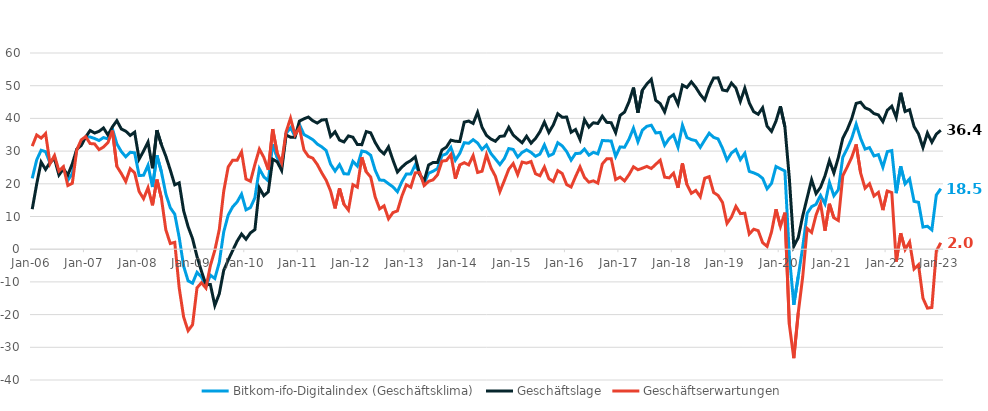
| Category | Bitkom-ifo-Digitalindex (Geschäftsklima) | Geschäftslage | Geschäftserwartungen |
|---|---|---|---|
| 2006-01-01 | 21.66 | 12.23 | 31.51 |
| 2006-02-01 | 27.29 | 19.9 | 34.93 |
| 2006-03-01 | 30.27 | 26.64 | 33.97 |
| 2006-04-01 | 29.82 | 24.39 | 35.37 |
| 2006-05-01 | 26.34 | 26.53 | 26.15 |
| 2006-06-01 | 28.18 | 27.72 | 28.64 |
| 2006-07-01 | 23.3 | 22.69 | 23.91 |
| 2006-08-01 | 24.9 | 24.57 | 25.23 |
| 2006-09-01 | 21.08 | 22.71 | 19.47 |
| 2006-10-01 | 23.12 | 26.12 | 20.15 |
| 2006-11-01 | 30.47 | 30.59 | 30.35 |
| 2006-12-01 | 32.56 | 31.7 | 33.42 |
| 2007-01-01 | 34.36 | 34.29 | 34.43 |
| 2007-02-01 | 34.31 | 36.31 | 32.31 |
| 2007-03-01 | 33.86 | 35.53 | 32.2 |
| 2007-04-01 | 33.23 | 36.04 | 30.45 |
| 2007-05-01 | 34.13 | 37.07 | 31.23 |
| 2007-06-01 | 33.75 | 34.92 | 32.58 |
| 2007-07-01 | 36.84 | 37.39 | 36.28 |
| 2007-08-01 | 32.21 | 39.31 | 25.32 |
| 2007-09-01 | 29.87 | 36.78 | 23.16 |
| 2007-10-01 | 28.26 | 36.1 | 20.69 |
| 2007-11-01 | 29.65 | 34.79 | 24.63 |
| 2007-12-01 | 29.47 | 35.79 | 23.32 |
| 2008-01-01 | 22.54 | 27.54 | 17.64 |
| 2008-02-01 | 22.6 | 30.01 | 15.44 |
| 2008-03-01 | 25.67 | 32.75 | 18.8 |
| 2008-04-01 | 19.02 | 24.77 | 13.41 |
| 2008-05-01 | 28.71 | 36.38 | 21.3 |
| 2008-06-01 | 23.68 | 31.99 | 15.67 |
| 2008-07-01 | 16.89 | 28.44 | 5.92 |
| 2008-08-01 | 12.68 | 24.22 | 1.73 |
| 2008-09-01 | 10.71 | 19.68 | 2.1 |
| 2008-10-01 | 3.59 | 20.29 | -11.84 |
| 2008-11-01 | -5.19 | 11.75 | -20.77 |
| 2008-12-01 | -9.68 | 6.89 | -24.93 |
| 2009-01-01 | -10.4 | 3.22 | -23.12 |
| 2009-02-01 | -7.08 | -2.24 | -11.8 |
| 2009-03-01 | -8.51 | -6.75 | -10.25 |
| 2009-04-01 | -11.37 | -10.87 | -11.88 |
| 2009-05-01 | -7.93 | -10.8 | -5.02 |
| 2009-06-01 | -8.96 | -17.21 | -0.34 |
| 2009-07-01 | -4.06 | -13.64 | 6 |
| 2009-08-01 | 5.3 | -6.45 | 17.75 |
| 2009-09-01 | 10.42 | -3.34 | 25.14 |
| 2009-10-01 | 12.94 | -0.43 | 27.2 |
| 2009-11-01 | 14.44 | 2.43 | 27.17 |
| 2009-12-01 | 16.84 | 4.64 | 29.76 |
| 2010-01-01 | 12.05 | 3.05 | 21.45 |
| 2010-02-01 | 12.74 | 5 | 20.77 |
| 2010-03-01 | 15.73 | 5.98 | 25.94 |
| 2010-04-01 | 24.6 | 18.75 | 30.6 |
| 2010-05-01 | 22.15 | 16.35 | 28.1 |
| 2010-06-01 | 20.88 | 17.54 | 24.26 |
| 2010-07-01 | 32.07 | 27.51 | 36.72 |
| 2010-08-01 | 28.07 | 26.73 | 29.43 |
| 2010-09-01 | 25.23 | 24.1 | 26.36 |
| 2010-10-01 | 35.4 | 34.93 | 35.86 |
| 2010-11-01 | 37.14 | 34.26 | 40.05 |
| 2010-12-01 | 34.57 | 34.21 | 34.93 |
| 2011-01-01 | 38.14 | 39.18 | 37.1 |
| 2011-02-01 | 35.08 | 39.87 | 30.4 |
| 2011-03-01 | 34.33 | 40.41 | 28.4 |
| 2011-04-01 | 33.49 | 39.28 | 27.83 |
| 2011-05-01 | 32.16 | 38.58 | 25.91 |
| 2011-06-01 | 31.3 | 39.5 | 23.37 |
| 2011-07-01 | 30.18 | 39.63 | 21.1 |
| 2011-08-01 | 25.99 | 34.51 | 17.77 |
| 2011-09-01 | 23.89 | 35.91 | 12.47 |
| 2011-10-01 | 25.87 | 33.37 | 18.62 |
| 2011-11-01 | 23.06 | 32.79 | 13.73 |
| 2011-12-01 | 23.01 | 34.64 | 11.96 |
| 2012-01-01 | 26.87 | 34.25 | 19.73 |
| 2012-02-01 | 25.41 | 32.02 | 18.98 |
| 2012-03-01 | 30.03 | 31.97 | 28.11 |
| 2012-04-01 | 29.73 | 35.98 | 23.66 |
| 2012-05-01 | 28.72 | 35.58 | 22.05 |
| 2012-06-01 | 24.17 | 32.65 | 16 |
| 2012-07-01 | 21.16 | 30.36 | 12.33 |
| 2012-08-01 | 21.05 | 29.13 | 13.25 |
| 2012-09-01 | 20.02 | 31.3 | 9.29 |
| 2012-10-01 | 19.06 | 27.23 | 11.2 |
| 2012-11-01 | 17.57 | 23.6 | 11.71 |
| 2012-12-01 | 20.63 | 25.11 | 16.24 |
| 2013-01-01 | 22.99 | 26.32 | 19.71 |
| 2013-02-01 | 22.99 | 27.1 | 18.94 |
| 2013-03-01 | 25.78 | 28.25 | 23.34 |
| 2013-04-01 | 23.14 | 22.84 | 23.45 |
| 2013-05-01 | 20.18 | 20.88 | 19.48 |
| 2013-06-01 | 23.23 | 25.76 | 20.74 |
| 2013-07-01 | 23.84 | 26.5 | 21.2 |
| 2013-08-01 | 24.64 | 26.53 | 22.76 |
| 2013-09-01 | 28.64 | 30.35 | 26.95 |
| 2013-10-01 | 29.16 | 31.22 | 27.11 |
| 2013-11-01 | 31.12 | 33.36 | 28.91 |
| 2013-12-01 | 27.21 | 33.02 | 21.55 |
| 2014-01-01 | 29.32 | 32.92 | 25.76 |
| 2014-02-01 | 32.57 | 38.86 | 26.45 |
| 2014-03-01 | 32.39 | 39.19 | 25.78 |
| 2014-04-01 | 33.49 | 38.45 | 28.63 |
| 2014-05-01 | 32.47 | 41.85 | 23.46 |
| 2014-06-01 | 30.47 | 37.29 | 23.84 |
| 2014-07-01 | 31.84 | 34.79 | 28.92 |
| 2014-08-01 | 29.25 | 33.69 | 24.89 |
| 2014-09-01 | 27.6 | 33.01 | 22.31 |
| 2014-10-01 | 25.88 | 34.49 | 17.58 |
| 2014-11-01 | 27.7 | 34.64 | 20.96 |
| 2014-12-01 | 30.78 | 37.28 | 24.46 |
| 2015-01-01 | 30.5 | 34.9 | 26.19 |
| 2015-02-01 | 28.19 | 33.7 | 22.81 |
| 2015-03-01 | 29.58 | 32.55 | 26.64 |
| 2015-04-01 | 30.39 | 34.54 | 26.31 |
| 2015-05-01 | 29.61 | 32.43 | 26.82 |
| 2015-06-01 | 28.41 | 33.86 | 23.08 |
| 2015-07-01 | 29.09 | 35.93 | 22.46 |
| 2015-08-01 | 31.91 | 38.88 | 25.15 |
| 2015-09-01 | 28.52 | 35.7 | 21.57 |
| 2015-10-01 | 29.18 | 38 | 20.68 |
| 2015-11-01 | 32.56 | 41.42 | 24.03 |
| 2015-12-01 | 31.6 | 40.37 | 23.14 |
| 2016-01-01 | 29.85 | 40.4 | 19.76 |
| 2016-02-01 | 27.24 | 35.76 | 19.02 |
| 2016-03-01 | 29.29 | 36.61 | 22.2 |
| 2016-04-01 | 29.31 | 33.52 | 25.18 |
| 2016-05-01 | 30.61 | 39.62 | 21.93 |
| 2016-06-01 | 28.76 | 37.33 | 20.5 |
| 2016-07-01 | 29.62 | 38.67 | 20.91 |
| 2016-08-01 | 29.15 | 38.44 | 20.21 |
| 2016-09-01 | 33.26 | 40.68 | 26.07 |
| 2016-10-01 | 33.15 | 38.79 | 27.64 |
| 2016-11-01 | 33.1 | 38.68 | 27.65 |
| 2016-12-01 | 28.36 | 35.64 | 21.3 |
| 2017-01-01 | 31.28 | 40.9 | 22.04 |
| 2017-02-01 | 31.17 | 41.93 | 20.88 |
| 2017-03-01 | 33.67 | 45.08 | 22.8 |
| 2017-04-01 | 37.01 | 49.43 | 25.2 |
| 2017-05-01 | 32.85 | 41.73 | 24.29 |
| 2017-06-01 | 36.4 | 48.63 | 24.77 |
| 2017-07-01 | 37.58 | 50.51 | 25.33 |
| 2017-08-01 | 37.92 | 51.95 | 24.68 |
| 2017-09-01 | 35.55 | 45.54 | 25.96 |
| 2017-10-01 | 35.72 | 44.54 | 27.22 |
| 2017-11-01 | 31.8 | 41.99 | 22.03 |
| 2017-12-01 | 33.78 | 46.39 | 21.82 |
| 2018-01-01 | 34.96 | 47.3 | 23.23 |
| 2018-02-01 | 31.18 | 44.31 | 18.76 |
| 2018-03-01 | 37.91 | 50.2 | 26.23 |
| 2018-04-01 | 34.15 | 49.46 | 19.78 |
| 2018-05-01 | 33.52 | 51.18 | 17.09 |
| 2018-06-01 | 33.19 | 49.47 | 17.97 |
| 2018-07-01 | 31.15 | 47.33 | 16.02 |
| 2018-08-01 | 33.37 | 45.64 | 21.7 |
| 2018-09-01 | 35.47 | 49.53 | 22.19 |
| 2018-10-01 | 34.2 | 52.36 | 17.34 |
| 2018-11-01 | 33.73 | 52.4 | 16.44 |
| 2018-12-01 | 30.85 | 48.69 | 14.29 |
| 2019-01-01 | 27.24 | 48.41 | 7.88 |
| 2019-02-01 | 29.41 | 50.8 | 9.84 |
| 2019-03-01 | 30.48 | 49.28 | 13.1 |
| 2019-04-01 | 27.39 | 45.2 | 10.88 |
| 2019-05-01 | 29.33 | 49.24 | 11.01 |
| 2019-06-01 | 23.79 | 44.76 | 4.63 |
| 2019-07-01 | 23.35 | 42.04 | 6.11 |
| 2019-08-01 | 22.75 | 41.26 | 5.67 |
| 2019-09-01 | 21.68 | 43.25 | 2.01 |
| 2019-10-01 | 18.46 | 37.62 | 0.86 |
| 2019-11-01 | 20.14 | 36.03 | 5.31 |
| 2019-12-01 | 25.29 | 39.17 | 12.21 |
| 2020-01-01 | 24.58 | 43.7 | 6.96 |
| 2020-02-01 | 23.92 | 37.43 | 11.18 |
| 2020-03-01 | -1.94 | 21.65 | -23.03 |
| 2020-04-01 | -17.03 | 0.88 | -33.34 |
| 2020-05-01 | -8.28 | 3.56 | -19.43 |
| 2020-06-01 | 0.65 | 10.17 | -8.44 |
| 2020-07-01 | 11 | 15.74 | 6.36 |
| 2020-08-01 | 13.02 | 21.23 | 5.1 |
| 2020-09-01 | 13.72 | 17.01 | 10.48 |
| 2020-10-01 | 16.44 | 18.94 | 13.97 |
| 2020-11-01 | 13.86 | 22.41 | 5.64 |
| 2020-12-01 | 20.4 | 27.11 | 13.89 |
| 2021-01-01 | 16.35 | 23.32 | 9.59 |
| 2021-02-01 | 18.18 | 28.02 | 8.76 |
| 2021-03-01 | 28.13 | 33.95 | 22.46 |
| 2021-04-01 | 30.8 | 36.58 | 25.16 |
| 2021-05-01 | 33.89 | 39.9 | 28.04 |
| 2021-06-01 | 38.24 | 44.58 | 32.06 |
| 2021-07-01 | 33.89 | 44.95 | 23.33 |
| 2021-08-01 | 30.61 | 43.24 | 18.64 |
| 2021-09-01 | 31.07 | 42.67 | 20.02 |
| 2021-10-01 | 28.52 | 41.48 | 16.26 |
| 2021-11-01 | 28.92 | 41.07 | 17.38 |
| 2021-12-01 | 25.07 | 39.01 | 11.95 |
| 2022-01-01 | 29.84 | 42.5 | 17.83 |
| 2022-02-01 | 30.16 | 43.73 | 17.35 |
| 2022-03-01 | 17.14 | 40.28 | -3.78 |
| 2022-04-01 | 25.35 | 47.85 | 4.89 |
| 2022-05-01 | 19.99 | 42.11 | -0.1 |
| 2022-06-01 | 21.51 | 42.67 | 2.2 |
| 2022-07-01 | 14.63 | 37.51 | -6.06 |
| 2022-08-01 | 14.33 | 35.27 | -4.75 |
| 2022-09-01 | 6.77 | 31.09 | -14.99 |
| 2022-10-01 | 7.03 | 35.52 | -18.02 |
| 2022-11-01 | 5.9 | 32.72 | -17.82 |
| 2022-12-01 | 16.56 | 35.18 | -0.58 |
| 2023-01-01 | 18.5 | 36.38 | 1.97 |